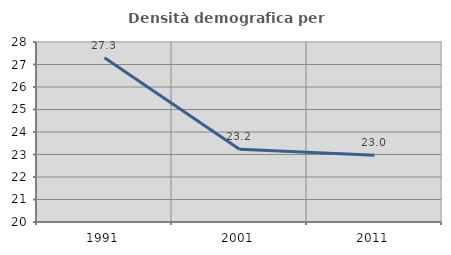
| Category | Densità demografica |
|---|---|
| 1991.0 | 27.301 |
| 2001.0 | 23.233 |
| 2011.0 | 22.961 |